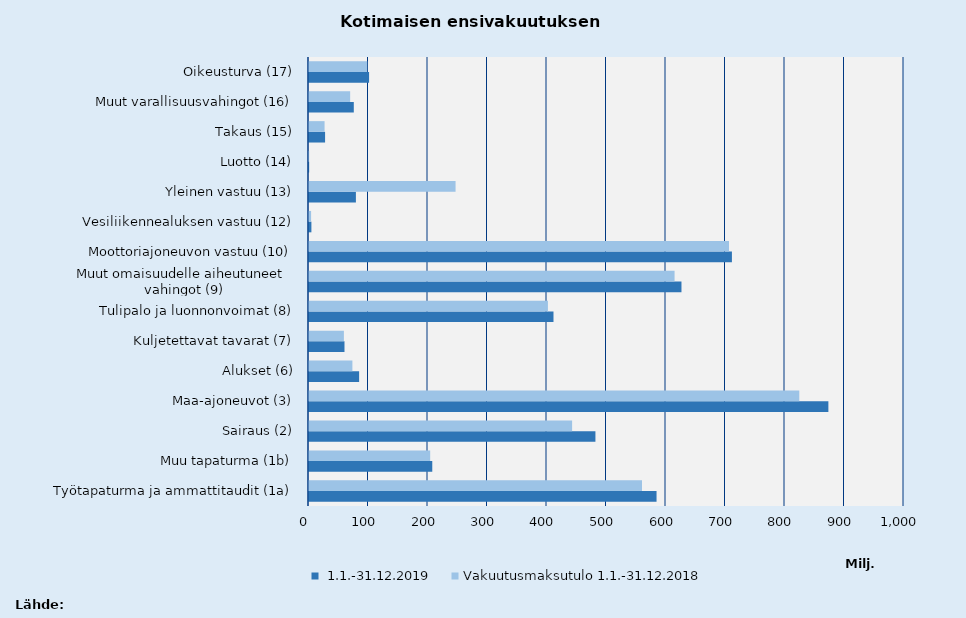
| Category | Vakuutusmaksutulo 1.1.-31.12.2019  | Vakuutusmaksutulo 1.1.-31.12.2018 |
|---|---|---|
| Työtapaturma ja ammattitaudit (1a) | 584107.618 | 559666.145 |
| Muu tapaturma (1b) | 207176.133 | 203677.443 |
| Sairaus (2) | 481392.029 | 442195.381 |
| Maa-ajoneuvot (3) | 872909.039 | 824036.139 |
| Alukset (6) | 84239.323 | 72920.45 |
| Kuljetettavat tavarat (7) | 59637.354 | 58636.91 |
| Tulipalo ja luonnonvoimat (8) | 410901.802 | 401537.64 |
| Muut omaisuudelle aiheutuneet 
vahingot (9) | 625996.929 | 614407.024 |
| Moottoriajoneuvon vastuu (10) | 710774.018 | 705892.408 |
| Vesiliikennealuksen vastuu (12) | 4030.047 | 3514.723 |
| Yleinen vastuu (13) | 78821.021 | 246323.511 |
| Luotto (14) | 276.984 | 263.968 |
| Takaus (15) | 27025.959 | 26170.212 |
| Muut varallisuusvahingot (16) | 75284.996 | 69180.597 |
| Oikeusturva (17) | 100971.288 | 97911.11 |